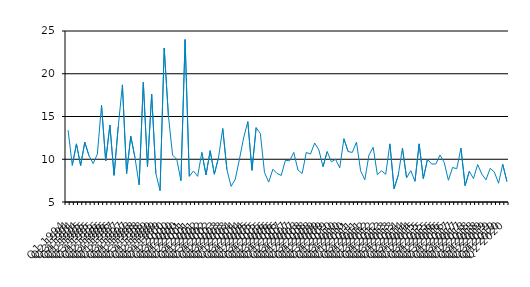
| Category | Series 0 |
|---|---|
| Q1 1994 | 13.4 |
| Q2 1994 | 9.28 |
| Q3 1994 | 11.8 |
| Q4 1994 | 9.26 |
| Q1 1995 | 12 |
| Q2 1995 | 10.4 |
| Q3 1995 | 9.5 |
| Q4 1995 | 10.6 |
| Q1 1996 | 16.3 |
| Q2 1996 | 9.8 |
| Q3 1996 | 14 |
| Q4 1996 | 8.12 |
| Q1 1997 | 13.8 |
| Q2 1997 | 18.7 |
| Q3 1997 | 8.33 |
| Q4 1997 | 12.7 |
| Q1 1998 | 10.2 |
| Q2 1998 | 7 |
| Q3 1998 | 19 |
| Q4 1998 | 9.11 |
| Q1 1999 | 17.6 |
| Q2 1999 | 8.33 |
| Q3 1999 | 6.33 |
| Q4 1999 | 23 |
| Q1 2000 | 15.1 |
| Q2 2000 | 10.5 |
| Q3 2000 | 10 |
| Q4 2000 | 7.5 |
| Q1 2001 | 24 |
| Q2 2001 | 8 |
| Q3 2001 | 8.62 |
| Q4 2001 | 8 |
| Q1 2002 | 10.8 |
| Q2 2002 | 8.16 |
| Q3 2002 | 11 |
| Q4 2002 | 8.25 |
| Q1 2003 | 10.2 |
| Q2 2003 | 13.6 |
| Q3 2003 | 8.8 |
| Q4 2003 | 6.83 |
| Q1 2004 | 7.66 |
| Q2 2004 | 10 |
| Q3 2004 | 12.5 |
| Q4 2004 | 14.4 |
| Q1 2005 | 8.71 |
| Q2 2005 | 13.7 |
| Q3 2005 | 13 |
| Q4 2005 | 8.44 |
| Q1 2006 | 7.33 |
| Q2 2006 | 8.83 |
| Q3 2006 | 8.33 |
| Q4 2006 | 8.11 |
| Q1 2007 | 9.88 |
| Q2 2007 | 9.82 |
| Q3 2007 | 10.8 |
| Q4 2007 | 8.75 |
| Q1 2008 | 8.33 |
| Q2 2008 | 10.8 |
| Q3 2008 | 10.6 |
| Q4 2008 | 11.9 |
| Q1 2009 | 11.1 |
| Q2 2009 | 9.13 |
| Q3 2009 | 10.9 |
| Q4 2009 | 9.69 |
| Q1 2010 | 10 |
| Q2 2010 | 9 |
| Q3 2010 | 12.4 |
| Q4 2010 | 10.9 |
| Q1 2011 | 10.8 |
| Q2 2011 | 12 |
| Q3 2011 | 8.64 |
| Q4 2011 | 7.6 |
| Q1 2012 | 10.5 |
| Q2 2012 | 11.4 |
| Q3 2012 | 8.2 |
| Q4 2012 | 8.65 |
| Q1 2013 | 8.24 |
| Q2 2013 | 11.8 |
| Q3 2013 | 6.55 |
| Q4 2013 | 8.14 |
| Q1 2014 | 11.3 |
| Q2 2014 | 7.83 |
| Q3 2014 | 8.67 |
| Q4 2014 | 7.42 |
| Q1 2015 | 11.8 |
| Q2 2015 | 7.74 |
| Q3 2015 | 10 |
| Q4 2015 | 9.44 |
| Q1 2016 | 9.45 |
| Q2 2016 | 10.5 |
| Q3 2016 | 9.62 |
| Q4 2016 | 7.54 |
| Q1 2017 | 9.04 |
| Q2 2017 | 8.89 |
| Q3 2017 | 11.3 |
| Q4 2017 | 6.91 |
| Q1 2018 | 8.6 |
| Q2 2018 | 7.74 |
| Q3 2018 | 9.38 |
| Q4 2018 | 8.26 |
| Q1 2019 | 7.6 |
| Q2 2019 | 8.941 |
| Q3 2019 | 8.5 |
| Q4 2019 | 7.19 |
| Q1 2020 | 9.41 |
| Q2 2021 | 7.4 |